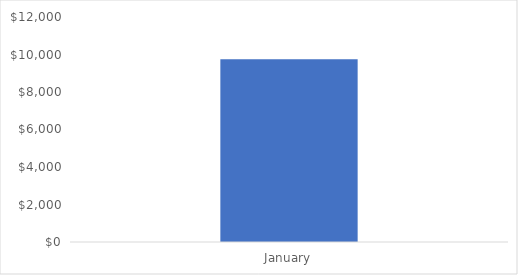
| Category | Profit |
|---|---|
| January | 9742 |
| February | 7389 |
| March | 5880 |
| April | 1437 |
| May | 9985 |
| June | 9825 |
| July | 4838 |
| August | 7161 |
| September | 7176 |
| October | 9094 |
| November | 7780 |